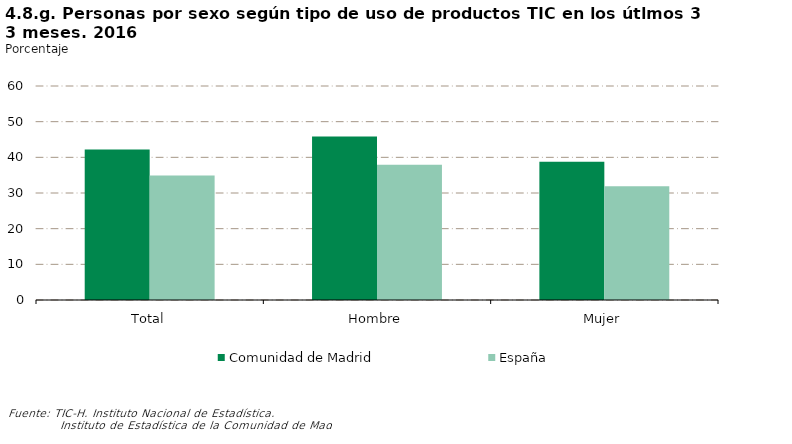
| Category | Comunidad de Madrid | España |
|---|---|---|
| Total | 42.165 | 34.899 |
| Hombre | 45.831 | 37.951 |
| Mujer | 38.736 | 31.884 |